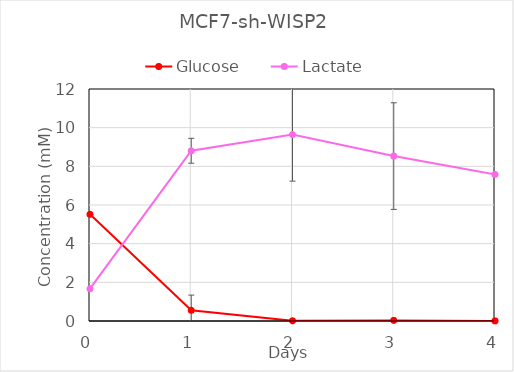
| Category | Glucose | Lactate |
|---|---|---|
| 0.0 | 5.52 | 1.67 |
| 1.0 | 0.555 | 8.805 |
| 2.0 | 0.01 | 9.645 |
| 3.0 | 0.03 | 8.53 |
| 4.0 | 0.005 | 7.585 |